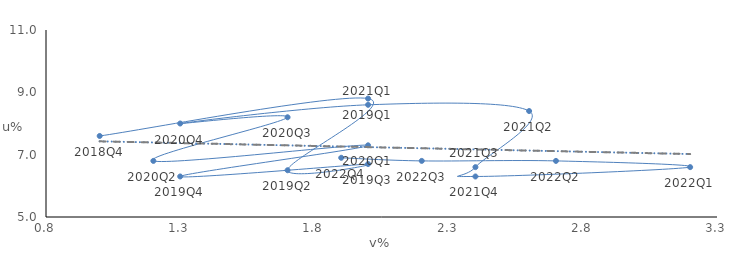
| Category | Unemployment and Vacancy Rate Percentage |
|---|---|
| 1.0 | 7.6 |
| 2.0 | 8.8 |
| 1.7 | 6.5 |
| 2.0 | 6.7 |
| 1.3 | 6.3 |
| 2.0 | 7.3 |
| 1.2 | 6.8 |
| 1.7 | 8.2 |
| 1.3 | 8 |
| 2.0 | 8.6 |
| 2.6 | 8.4 |
| 2.4 | 6.6 |
| 2.4 | 6.3 |
| 3.2 | 6.6 |
| 2.7 | 6.8 |
| 2.2 | 6.8 |
| 1.9 | 6.9 |